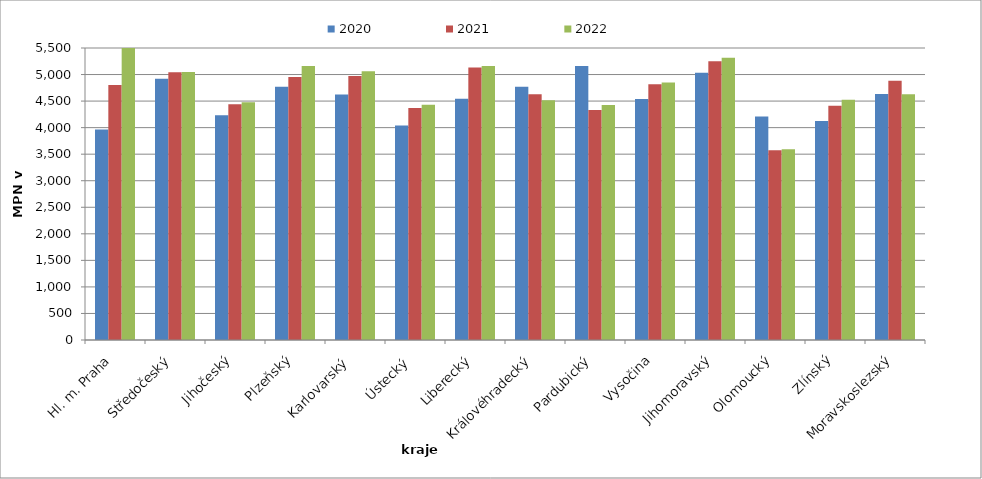
| Category | 2020 | 2021 | 2022 |
|---|---|---|---|
| Hl. m. Praha | 3966 | 4805 | 5785 |
| Středočeský | 4919 | 5044 | 5047 |
| Jihočeský | 4234 | 4441 | 4476 |
| Plzeňský | 4769 | 4956 | 5161 |
| Karlovarský  | 4626 | 4974 | 5061 |
| Ústecký   | 4040 | 4371 | 4431 |
| Liberecký | 4546 | 5135 | 5163 |
| Královéhradecký | 4772 | 4630 | 4514 |
| Pardubický | 5159 | 4334 | 4425 |
| Vysočina | 4538 | 4816 | 4850 |
| Jihomoravský | 5033 | 5251 | 5314 |
| Olomoucký | 4210 | 3573 | 3592 |
| Zlínský | 4123 | 4414 | 4526 |
| Moravskoslezský | 4633 | 4881 | 4629 |